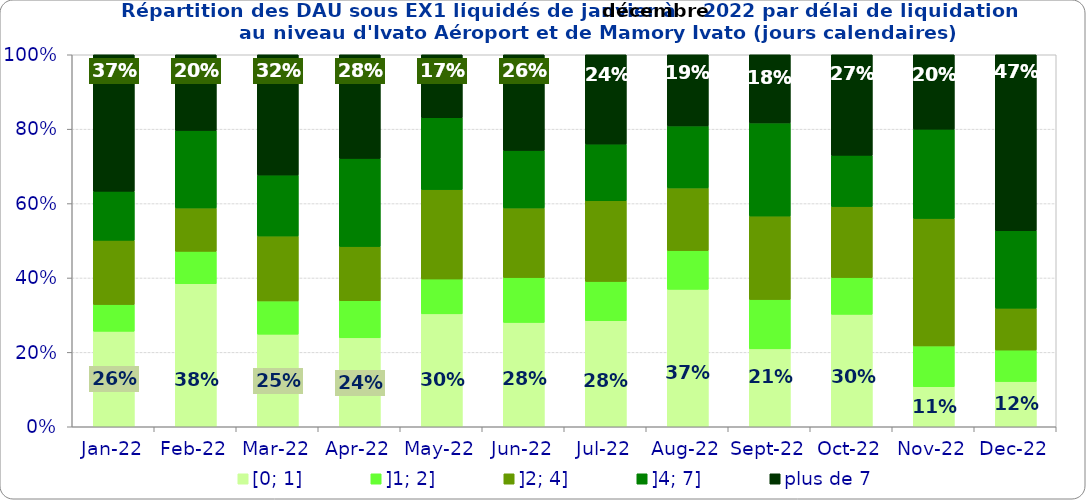
| Category | [0; 1] | ]1; 2] | ]2; 4] | ]4; 7] | plus de 7 |
|---|---|---|---|---|---|
| 2022-01-01 | 0.257 | 0.072 | 0.173 | 0.132 | 0.367 |
| 2022-02-01 | 0.385 | 0.087 | 0.117 | 0.208 | 0.203 |
| 2022-03-01 | 0.249 | 0.089 | 0.174 | 0.164 | 0.323 |
| 2022-04-01 | 0.239 | 0.1 | 0.146 | 0.237 | 0.279 |
| 2022-05-01 | 0.303 | 0.094 | 0.24 | 0.193 | 0.169 |
| 2022-06-01 | 0.281 | 0.121 | 0.187 | 0.155 | 0.257 |
| 2022-07-01 | 0.285 | 0.106 | 0.217 | 0.152 | 0.24 |
| 2022-08-01 | 0.369 | 0.104 | 0.169 | 0.167 | 0.191 |
| 2022-09-01 | 0.209 | 0.133 | 0.224 | 0.25 | 0.183 |
| 2022-10-01 | 0.302 | 0.099 | 0.191 | 0.138 | 0.27 |
| 2022-11-01 | 0.108 | 0.11 | 0.343 | 0.24 | 0.2 |
| 2022-12-01 | 0.121 | 0.085 | 0.113 | 0.208 | 0.473 |